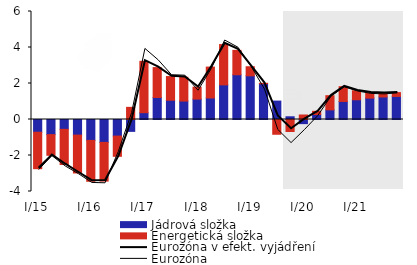
| Category | Jádrová složka | Energetická složka |
|---|---|---|
| I/15 | -0.708 | -2.025 |
| II | -0.84 | -1.149 |
| III | -0.548 | -1.954 |
| IV | -0.866 | -2.104 |
| I/16 | -1.162 | -2.271 |
| II | -1.273 | -2.15 |
| III | -0.923 | -1.123 |
| IV | -0.66 | 0.675 |
| I/17 | 0.378 | 2.853 |
| II | 1.224 | 1.66 |
| III | 1.07 | 1.316 |
| IV | 1.025 | 1.321 |
| I/18 | 1.134 | 0.662 |
| II | 1.196 | 1.716 |
| III | 1.925 | 2.238 |
| IV | 2.487 | 1.354 |
| I/19 | 2.428 | 0.504 |
| II | 1.988 | 0.024 |
| III | 1.023 | -0.82 |
| IV | 0.152 | -0.667 |
| I/20 | -0.23 | 0.251 |
| II | 0.278 | 0.177 |
| III | 0.536 | 0.787 |
| IV | 1.002 | 0.821 |
| I/21 | 1.096 | 0.501 |
| II | 1.187 | 0.303 |
| III | 1.252 | 0.213 |
| IV | 1.282 | 0.211 |